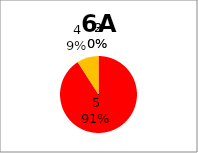
| Category | Series 0 |
|---|---|
| 5.0 | 10 |
| 4.0 | 1 |
| 3.0 | 0 |
| 2.0 | 0 |